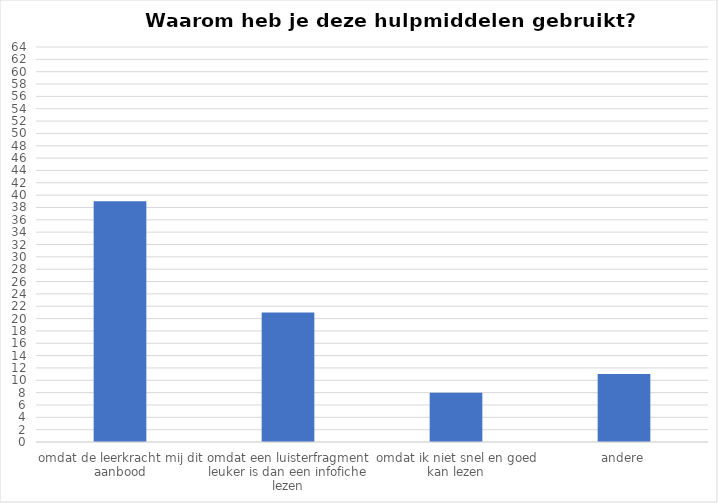
| Category | Series 0 |
|---|---|
| omdat de leerkracht mij dit aanbood | 39 |
| omdat een luisterfragment leuker is dan een infofiche lezen | 21 |
| omdat ik niet snel en goed kan lezen | 8 |
| andere | 11 |